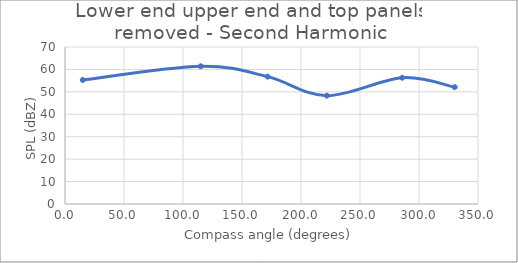
| Category | Series 0 |
|---|---|
| 15.06445125542554 | 55.3 |
| 115.00449447818254 | 61.4 |
| 171.7068171198818 | 56.8 |
| 221.8691292075067 | 48.3 |
| 285.7828166838848 | 56.3 |
| 330.28010595813004 | 52.1 |